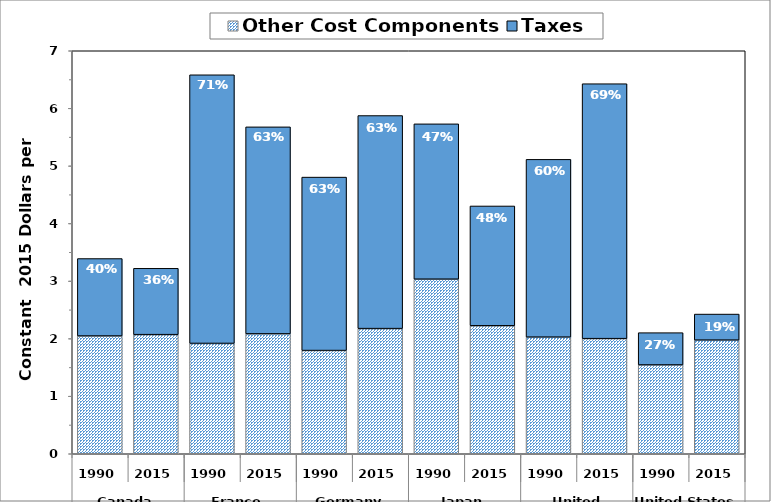
| Category | Other Cost Components | Taxes |
|---|---|---|
| 0 | 2.045 | 1.346 |
| 1 | 2.069 | 1.153 |
| 2 | 1.916 | 4.667 |
| 3 | 2.082 | 3.596 |
| 4 | 1.792 | 3.013 |
| 5 | 2.174 | 3.701 |
| 6 | 3.031 | 2.699 |
| 7 | 2.223 | 2.081 |
| 8 | 2.025 | 3.089 |
| 9 | 1.999 | 4.429 |
| 10 | 1.542 | 0.562 |
| 11 | 1.973 | 0.453 |